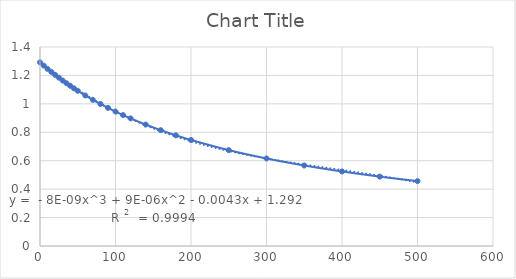
| Category | Series 0 |
|---|---|
| 0.0 | 1.292 |
| 5.0 | 1.269 |
| 10.0 | 1.246 |
| 15.0 | 1.225 |
| 20.0 | 1.204 |
| 25.0 | 1.184 |
| 30.0 | 1.164 |
| 35.0 | 1.145 |
| 40.0 | 1.127 |
| 45.0 | 1.109 |
| 50.0 | 1.092 |
| 60.0 | 1.059 |
| 70.0 | 1.028 |
| 80.0 | 0.999 |
| 90.0 | 0.972 |
| 100.0 | 0.946 |
| 110.0 | 0.921 |
| 120.0 | 0.898 |
| 140.0 | 0.854 |
| 160.0 | 0.815 |
| 180.0 | 0.779 |
| 200.0 | 0.746 |
| 250.0 | 0.675 |
| 300.0 | 0.616 |
| 350.0 | 0.566 |
| 400.0 | 0.524 |
| 450.0 | 0.488 |
| 500.0 | 0.456 |